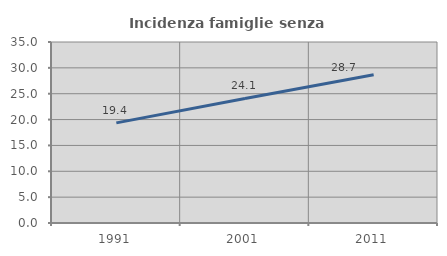
| Category | Incidenza famiglie senza nuclei |
|---|---|
| 1991.0 | 19.36 |
| 2001.0 | 24.084 |
| 2011.0 | 28.678 |